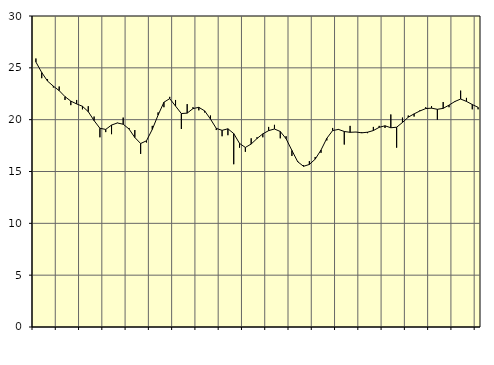
| Category | Piggar | Series 1 |
|---|---|---|
| nan | 25.9 | 25.56 |
| 1.0 | 24 | 24.55 |
| 1.0 | 23.9 | 23.72 |
| 1.0 | 23.1 | 23.23 |
| nan | 23.2 | 22.8 |
| 2.0 | 21.9 | 22.22 |
| 2.0 | 21.4 | 21.79 |
| 2.0 | 21.9 | 21.52 |
| nan | 21 | 21.29 |
| 3.0 | 21.3 | 20.77 |
| 3.0 | 20.3 | 19.91 |
| 3.0 | 18.3 | 19.17 |
| nan | 18.8 | 19.06 |
| 4.0 | 18.6 | 19.48 |
| 4.0 | 19.7 | 19.68 |
| 4.0 | 20.2 | 19.56 |
| nan | 19.2 | 19.1 |
| 5.0 | 19 | 18.28 |
| 5.0 | 16.7 | 17.7 |
| 5.0 | 17.8 | 17.96 |
| nan | 19.4 | 19.06 |
| 6.0 | 20.7 | 20.44 |
| 6.0 | 21.2 | 21.68 |
| 6.0 | 22.2 | 22.03 |
| nan | 21.9 | 21.31 |
| 7.0 | 19.1 | 20.59 |
| 7.0 | 21.5 | 20.63 |
| 7.0 | 21.2 | 21.07 |
| nan | 20.9 | 21.19 |
| 8.0 | 20.7 | 20.85 |
| 8.0 | 20.4 | 20.06 |
| 8.0 | 19 | 19.16 |
| nan | 18.4 | 18.97 |
| 9.0 | 18.5 | 19.12 |
| 9.0 | 15.7 | 18.66 |
| 9.0 | 17.3 | 17.71 |
| nan | 16.9 | 17.32 |
| 10.0 | 18.2 | 17.65 |
| 10.0 | 18.3 | 18.18 |
| 10.0 | 18.3 | 18.63 |
| nan | 19.3 | 18.94 |
| 11.0 | 19.5 | 19.1 |
| 11.0 | 18.2 | 18.86 |
| 11.0 | 18.4 | 18.16 |
| nan | 16.5 | 17.03 |
| 12.0 | 16 | 15.94 |
| 12.0 | 15.6 | 15.5 |
| 12.0 | 16 | 15.68 |
| nan | 16.4 | 16.19 |
| 13.0 | 16.8 | 17.07 |
| 13.0 | 18 | 18.2 |
| 13.0 | 19.2 | 18.95 |
| nan | 19.1 | 19.06 |
| 14.0 | 17.6 | 18.86 |
| 14.0 | 19.4 | 18.78 |
| 14.0 | 18.8 | 18.81 |
| nan | 18.8 | 18.73 |
| 15.0 | 18.7 | 18.79 |
| 15.0 | 19.3 | 18.95 |
| 15.0 | 19.4 | 19.26 |
| nan | 19.2 | 19.41 |
| 16.0 | 20.5 | 19.22 |
| 16.0 | 17.3 | 19.27 |
| 16.0 | 20.2 | 19.73 |
| nan | 20.4 | 20.24 |
| 17.0 | 20.3 | 20.56 |
| 17.0 | 20.9 | 20.84 |
| 17.0 | 21.2 | 21.07 |
| nan | 21.3 | 21.11 |
| 18.0 | 20 | 21 |
| 18.0 | 21.7 | 21.09 |
| 18.0 | 21.2 | 21.4 |
| nan | 21.7 | 21.75 |
| 19.0 | 22.8 | 21.99 |
| 19.0 | 22.1 | 21.76 |
| 19.0 | 21 | 21.46 |
| nan | 21 | 21.19 |